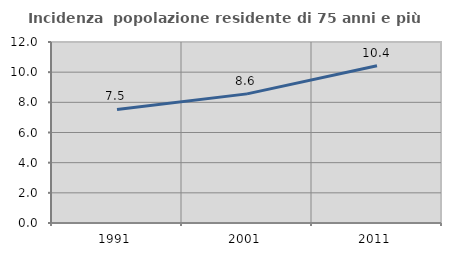
| Category | Incidenza  popolazione residente di 75 anni e più |
|---|---|
| 1991.0 | 7.528 |
| 2001.0 | 8.56 |
| 2011.0 | 10.426 |